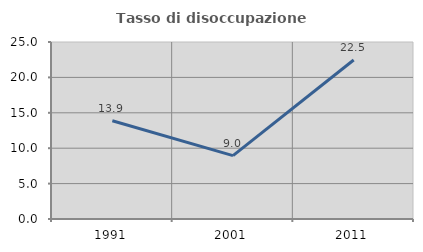
| Category | Tasso di disoccupazione giovanile  |
|---|---|
| 1991.0 | 13.88 |
| 2001.0 | 8.955 |
| 2011.0 | 22.464 |